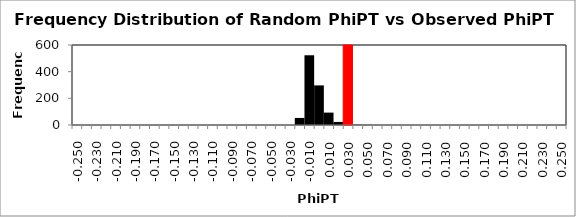
| Category | Permute PhiPT |
|---|---|
| -0.25 | 0 |
| -0.24 | 0 |
| -0.22999999999999998 | 0 |
| -0.21999999999999997 | 0 |
| -0.20999999999999996 | 0 |
| -0.19999999999999996 | 0 |
| -0.18999999999999995 | 0 |
| -0.17999999999999994 | 0 |
| -0.16999999999999993 | 0 |
| -0.15999999999999992 | 0 |
| -0.1499999999999999 | 0 |
| -0.1399999999999999 | 0 |
| -0.1299999999999999 | 0 |
| -0.1199999999999999 | 0 |
| -0.1099999999999999 | 0 |
| -0.09999999999999991 | 0 |
| -0.08999999999999991 | 0 |
| -0.07999999999999992 | 0 |
| -0.06999999999999992 | 0 |
| -0.05999999999999992 | 0 |
| -0.04999999999999992 | 0 |
| -0.03999999999999992 | 0 |
| -0.029999999999999916 | 0 |
| -0.019999999999999914 | 53 |
| -0.009999999999999913 | 523 |
| 8.673617379884035e-17 | 297 |
| 0.010000000000000087 | 93 |
| 0.020000000000000087 | 23 |
| 0.03000000000000009 | 7 |
| 0.04000000000000009 | 2 |
| 0.05000000000000009 | 1 |
| 0.060000000000000095 | 0 |
| 0.07000000000000009 | 0 |
| 0.08000000000000008 | 0 |
| 0.09000000000000008 | 0 |
| 0.10000000000000007 | 0 |
| 0.11000000000000007 | 0 |
| 0.12000000000000006 | 0 |
| 0.13000000000000006 | 0 |
| 0.14000000000000007 | 0 |
| 0.15000000000000008 | 0 |
| 0.1600000000000001 | 0 |
| 0.1700000000000001 | 0 |
| 0.1800000000000001 | 0 |
| 0.1900000000000001 | 0 |
| 0.20000000000000012 | 0 |
| 0.21000000000000013 | 0 |
| 0.22000000000000014 | 0 |
| 0.23000000000000015 | 0 |
| 0.24000000000000016 | 0 |
| 0.25000000000000017 | 0 |